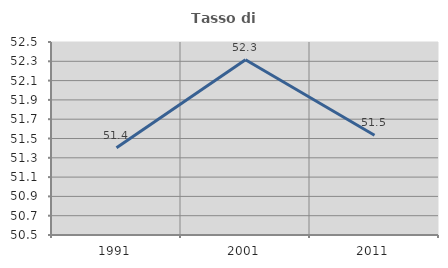
| Category | Tasso di occupazione   |
|---|---|
| 1991.0 | 51.405 |
| 2001.0 | 52.316 |
| 2011.0 | 51.534 |